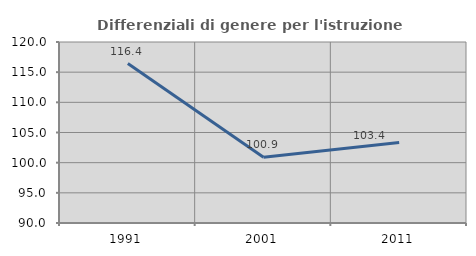
| Category | Differenziali di genere per l'istruzione superiore |
|---|---|
| 1991.0 | 116.426 |
| 2001.0 | 100.914 |
| 2011.0 | 103.351 |